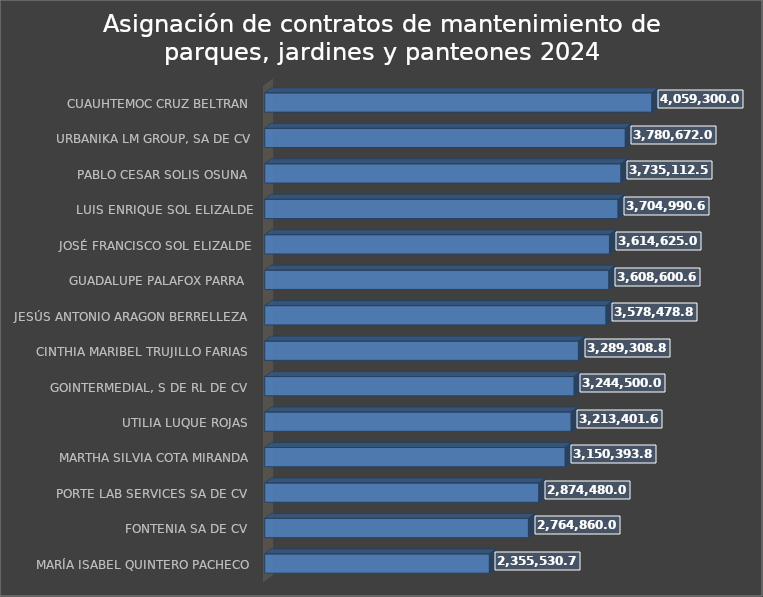
| Category | Total |
|---|---|
| MARÍA ISABEL QUINTERO PACHECO | 2355530.7 |
| FONTENIA SA DE CV  | 2764860 |
| PORTE LAB SERVICES SA DE CV  | 2874480 |
| MARTHA SILVIA COTA MIRANDA | 3150393.8 |
| UTILIA LUQUE ROJAS  | 3213401.6 |
| GOINTERMEDIAL, S DE RL DE CV  | 3244500 |
| CINTHIA MARIBEL TRUJILLO FARIAS  | 3289308.8 |
| JESÚS ANTONIO ARAGON BERRELLEZA  | 3578478.8 |
| GUADALUPE PALAFOX PARRA  | 3608600.6 |
| JOSÉ FRANCISCO SOL ELIZALDE | 3614625 |
| LUIS ENRIQUE SOL ELIZALDE | 3704990.6 |
| PABLO CESAR SOLIS OSUNA  | 3735112.5 |
| URBANIKA LM GROUP, SA DE CV | 3780672 |
| CUAUHTEMOC CRUZ BELTRAN | 4059300 |